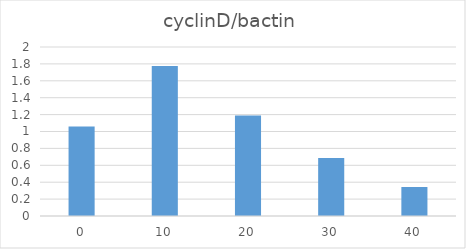
| Category | cyclinD/bactin |
|---|---|
| 0.0 | 1.059 |
| 10.0 | 1.776 |
| 20.0 | 1.188 |
| 30.0 | 0.685 |
| 40.0 | 0.343 |